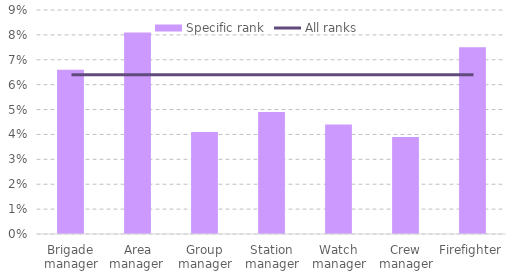
| Category | Specific rank |
|---|---|
| Brigade manager | 0.066 |
| Area manager  | 0.081 |
| Group manager | 0.041 |
| Station manager | 0.049 |
| Watch manager | 0.044 |
| Crew manager | 0.039 |
| Firefighter | 0.075 |